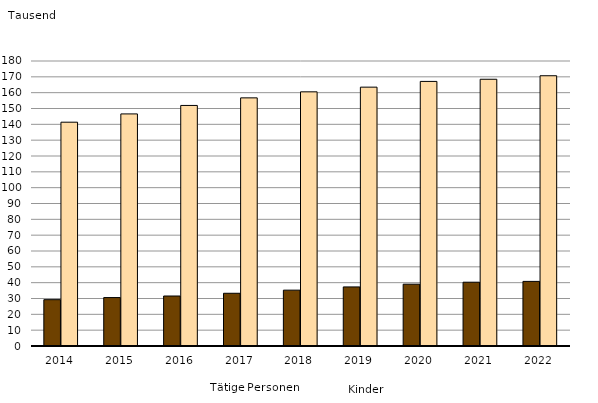
| Category | Tätige Personen | Kinder |
|---|---|---|
| 2014.0 | 29251 | 141347 |
| 2015.0 | 30592 | 146583 |
| 2016.0 | 31577 | 151928 |
| 2017.0 | 33305 | 156714 |
| 2018.0 | 35272 | 160527 |
| 2019.0 | 37321 | 163487 |
| 2020.0 | 39036 | 167104 |
| 2021.0 | 40292 | 168470 |
| 2022.0 | 40800 | 170687 |